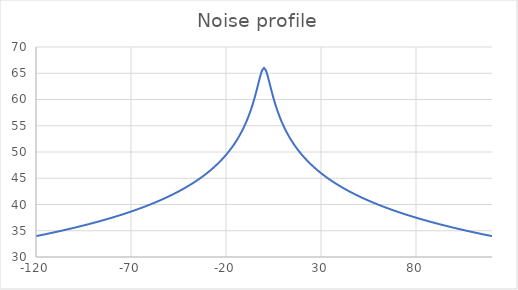
| Category | Series 0 |
|---|---|
| -120.0 | 33.977 |
| -119.0 | 34.049 |
| -118.0 | 34.123 |
| -117.0 | 34.196 |
| -116.0 | 34.271 |
| -115.0 | 34.346 |
| -114.0 | 34.422 |
| -113.0 | 34.498 |
| -112.0 | 34.576 |
| -111.0 | 34.653 |
| -110.0 | 34.732 |
| -109.0 | 34.811 |
| -108.0 | 34.891 |
| -107.0 | 34.972 |
| -106.0 | 35.053 |
| -105.0 | 35.136 |
| -104.0 | 35.219 |
| -103.0 | 35.303 |
| -102.0 | 35.387 |
| -101.0 | 35.473 |
| -100.0 | 35.559 |
| -99.0 | 35.646 |
| -98.0 | 35.734 |
| -97.0 | 35.823 |
| -96.0 | 35.913 |
| -95.0 | 36.004 |
| -94.0 | 36.096 |
| -93.0 | 36.189 |
| -92.0 | 36.283 |
| -91.0 | 36.377 |
| -90.0 | 36.473 |
| -89.0 | 36.57 |
| -88.0 | 36.668 |
| -87.0 | 36.767 |
| -86.0 | 36.868 |
| -85.0 | 36.969 |
| -84.0 | 37.072 |
| -83.0 | 37.176 |
| -82.0 | 37.281 |
| -81.0 | 37.387 |
| -80.0 | 37.495 |
| -79.0 | 37.604 |
| -78.0 | 37.715 |
| -77.0 | 37.827 |
| -76.0 | 37.94 |
| -75.0 | 38.055 |
| -74.0 | 38.171 |
| -73.0 | 38.289 |
| -72.0 | 38.409 |
| -71.0 | 38.53 |
| -70.0 | 38.653 |
| -69.0 | 38.778 |
| -68.0 | 38.904 |
| -67.0 | 39.033 |
| -66.0 | 39.163 |
| -65.0 | 39.296 |
| -64.0 | 39.43 |
| -63.0 | 39.566 |
| -62.0 | 39.705 |
| -61.0 | 39.846 |
| -60.0 | 39.989 |
| -59.0 | 40.135 |
| -58.0 | 40.283 |
| -57.0 | 40.434 |
| -56.0 | 40.587 |
| -55.0 | 40.743 |
| -54.0 | 40.902 |
| -53.0 | 41.064 |
| -52.0 | 41.229 |
| -51.0 | 41.397 |
| -50.0 | 41.568 |
| -49.0 | 41.743 |
| -48.0 | 41.921 |
| -47.0 | 42.103 |
| -46.0 | 42.289 |
| -45.0 | 42.48 |
| -44.0 | 42.674 |
| -43.0 | 42.873 |
| -42.0 | 43.076 |
| -41.0 | 43.284 |
| -40.0 | 43.497 |
| -39.0 | 43.716 |
| -38.0 | 43.94 |
| -37.0 | 44.171 |
| -36.0 | 44.407 |
| -35.0 | 44.65 |
| -34.0 | 44.9 |
| -33.0 | 45.157 |
| -32.0 | 45.422 |
| -31.0 | 45.695 |
| -30.0 | 45.977 |
| -29.0 | 46.269 |
| -28.0 | 46.57 |
| -27.0 | 46.882 |
| -26.0 | 47.206 |
| -25.0 | 47.542 |
| -24.0 | 47.891 |
| -23.0 | 48.255 |
| -22.0 | 48.635 |
| -21.0 | 49.031 |
| -20.0 | 49.446 |
| -19.0 | 49.881 |
| -18.0 | 50.339 |
| -17.0 | 50.821 |
| -16.0 | 51.331 |
| -15.0 | 51.871 |
| -14.0 | 52.445 |
| -13.0 | 53.059 |
| -12.0 | 53.716 |
| -11.0 | 54.424 |
| -10.0 | 55.189 |
| -9.0 | 56.021 |
| -8.0 | 56.93 |
| -7.0 | 57.929 |
| -6.0 | 59.031 |
| -5.0 | 60.248 |
| -4.0 | 61.584 |
| -3.0 | 63.01 |
| -2.0 | 64.424 |
| -1.0 | 65.563 |
| 0.0 | 66.021 |
| 1.0 | 65.563 |
| 2.0 | 64.424 |
| 3.0 | 63.01 |
| 4.0 | 61.584 |
| 5.0 | 60.248 |
| 6.0 | 59.031 |
| 7.0 | 57.929 |
| 8.0 | 56.93 |
| 9.0 | 56.021 |
| 10.0 | 55.189 |
| 11.0 | 54.424 |
| 12.0 | 53.716 |
| 13.0 | 53.059 |
| 14.0 | 52.445 |
| 15.0 | 51.871 |
| 16.0 | 51.331 |
| 17.0 | 50.821 |
| 18.0 | 50.339 |
| 19.0 | 49.881 |
| 20.0 | 49.446 |
| 21.0 | 49.031 |
| 22.0 | 48.635 |
| 23.0 | 48.255 |
| 24.0 | 47.891 |
| 25.0 | 47.542 |
| 26.0 | 47.206 |
| 27.0 | 46.882 |
| 28.0 | 46.57 |
| 29.0 | 46.269 |
| 30.0 | 45.977 |
| 31.0 | 45.695 |
| 32.0 | 45.422 |
| 33.0 | 45.157 |
| 34.0 | 44.9 |
| 35.0 | 44.65 |
| 36.0 | 44.407 |
| 37.0 | 44.171 |
| 38.0 | 43.94 |
| 39.0 | 43.716 |
| 40.0 | 43.497 |
| 41.0 | 43.284 |
| 42.0 | 43.076 |
| 43.0 | 42.873 |
| 44.0 | 42.674 |
| 45.0 | 42.48 |
| 46.0 | 42.289 |
| 47.0 | 42.103 |
| 48.0 | 41.921 |
| 49.0 | 41.743 |
| 50.0 | 41.568 |
| 51.0 | 41.397 |
| 52.0 | 41.229 |
| 53.0 | 41.064 |
| 54.0 | 40.902 |
| 55.0 | 40.743 |
| 56.0 | 40.587 |
| 57.0 | 40.434 |
| 58.0 | 40.283 |
| 59.0 | 40.135 |
| 60.0 | 39.989 |
| 61.0 | 39.846 |
| 62.0 | 39.705 |
| 63.0 | 39.566 |
| 64.0 | 39.43 |
| 65.0 | 39.296 |
| 66.0 | 39.163 |
| 67.0 | 39.033 |
| 68.0 | 38.904 |
| 69.0 | 38.778 |
| 70.0 | 38.653 |
| 71.0 | 38.53 |
| 72.0 | 38.409 |
| 73.0 | 38.289 |
| 74.0 | 38.171 |
| 75.0 | 38.055 |
| 76.0 | 37.94 |
| 77.0 | 37.827 |
| 78.0 | 37.715 |
| 79.0 | 37.604 |
| 80.0 | 37.495 |
| 81.0 | 37.387 |
| 82.0 | 37.281 |
| 83.0 | 37.176 |
| 84.0 | 37.072 |
| 85.0 | 36.969 |
| 86.0 | 36.868 |
| 87.0 | 36.767 |
| 88.0 | 36.668 |
| 89.0 | 36.57 |
| 90.0 | 36.473 |
| 91.0 | 36.377 |
| 92.0 | 36.283 |
| 93.0 | 36.189 |
| 94.0 | 36.096 |
| 95.0 | 36.004 |
| 96.0 | 35.913 |
| 97.0 | 35.823 |
| 98.0 | 35.734 |
| 99.0 | 35.646 |
| 100.0 | 35.559 |
| 101.0 | 35.473 |
| 102.0 | 35.387 |
| 103.0 | 35.303 |
| 104.0 | 35.219 |
| 105.0 | 35.136 |
| 106.0 | 35.053 |
| 107.0 | 34.972 |
| 108.0 | 34.891 |
| 109.0 | 34.811 |
| 110.0 | 34.732 |
| 111.0 | 34.653 |
| 112.0 | 34.576 |
| 113.0 | 34.498 |
| 114.0 | 34.422 |
| 115.0 | 34.346 |
| 116.0 | 34.271 |
| 117.0 | 34.196 |
| 118.0 | 34.123 |
| 119.0 | 34.049 |
| 120.0 | 33.977 |